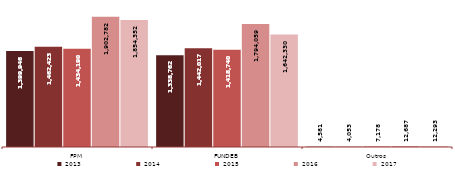
| Category | 2013 | 2014 | 2015 | 2016 | 2017 |
|---|---|---|---|---|---|
| FPM | 1399946 | 1462423.04 | 1434190.256 | 1902782 | 1854352 |
| FUNDEB | 1338762 | 1442017.169 | 1418740.238 | 1794059 | 1642330 |
| Outros | 4581 | 4052.877 | 7178.149 | 12687 | 12293 |